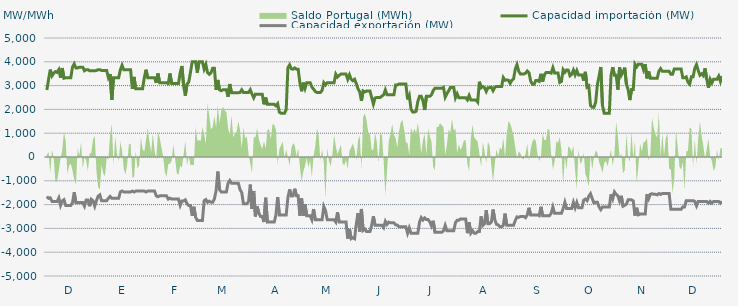
| Category | Capacidad importación (MW) | Capacidad exportación (MW) |
|---|---|---|
| 0 | 2812.5 | -1658.333 |
| 1900-01-01 | 3262.5 | -1737.5 |
| 1900-01-02 | 3670.833 | -1716.667 |
| 1900-01-03 | 3404.167 | -1866.667 |
| 1900-01-04 | 3512.5 | -1866.667 |
| 1900-01-05 | 3589.583 | -1866.667 |
| 1900-01-06 | 3556.25 | -1866.667 |
| 1900-01-07 | 3670.833 | -1716.667 |
| 1900-01-08 | 3329.167 | -2033.333 |
| 1900-01-09 | 3737.5 | -1845.833 |
| 1900-01-10 | 3310.417 | -1791.667 |
| 1900-01-11 | 3329.167 | -2033.333 |
| 1900-01-12 | 3329.167 | -2033.333 |
| 1900-01-13 | 3329.167 | -2033.333 |
| 1900-01-14 | 3329.167 | -2033.333 |
| 1900-01-15 | 3775 | -1916.667 |
| 1900-01-16 | 3912.5 | -1485.417 |
| 1900-01-17 | 3743.75 | -1916.667 |
| 1900-01-18 | 3743.75 | -1916.667 |
| 1900-01-19 | 3775 | -1916.667 |
| 1900-01-20 | 3775 | -1916.667 |
| 1900-01-21 | 3775 | -1916.667 |
| 1900-01-22 | 3625 | -2066.667 |
| 1900-01-23 | 3670.833 | -1804.167 |
| 1900-01-24 | 3670.833 | -1804.167 |
| 1900-01-25 | 3625 | -2066.667 |
| 1900-01-26 | 3625 | -1779.167 |
| 1900-01-27 | 3625 | -1841.667 |
| 1900-01-28 | 3625 | -2066.667 |
| 1900-01-29 | 3633.333 | -1833.333 |
| 1900-01-30 | 3670.833 | -1645.833 |
| 1900-01-31 | 3670.833 | -1591.667 |
| 1900-02-01 | 3633.333 | -1833.333 |
| 1900-02-02 | 3633.333 | -1833.333 |
| 1900-02-03 | 3633.333 | -1833.333 |
| 1900-02-04 | 3633.333 | -1833.333 |
| 1900-02-05 | 3333.333 | -1733.333 |
| 1900-02-06 | 3483.333 | -1658.333 |
| 1900-02-07 | 2393.75 | -1733.333 |
| 1900-02-08 | 3333.333 | -1733.333 |
| 1900-02-09 | 3333.333 | -1733.333 |
| 1900-02-10 | 3333.333 | -1733.333 |
| 1900-02-11 | 3333.333 | -1733.333 |
| 1900-02-12 | 3662.5 | -1466.667 |
| 1900-02-13 | 3854.167 | -1429.167 |
| 1900-02-14 | 3662.5 | -1466.667 |
| 1900-02-15 | 3662.5 | -1466.667 |
| 1900-02-16 | 3662.5 | -1466.667 |
| 1900-02-17 | 3662.5 | -1466.667 |
| 1900-02-18 | 3662.5 | -1466.667 |
| 1900-02-19 | 2862.5 | -1433.333 |
| 1900-02-20 | 3364.583 | -1470.833 |
| 1900-02-21 | 2862.5 | -1433.333 |
| 1900-02-22 | 2862.5 | -1433.333 |
| 1900-02-23 | 2862.5 | -1433.333 |
| 1900-02-24 | 2862.5 | -1433.333 |
| 1900-02-25 | 2862.5 | -1433.333 |
| 1900-02-26 | 3333.333 | -1433.333 |
| 1900-02-27 | 3666.667 | -1470.833 |
| 1900-02-28 | 3333.333 | -1433.333 |
| 1900-02-28 | 3333.333 | -1433.333 |
| 1900-03-01 | 3333.333 | -1433.333 |
| 1900-03-02 | 3333.333 | -1433.333 |
| 1900-03-03 | 3333.333 | -1433.333 |
| 1900-03-04 | 3116.667 | -1633.333 |
| 1900-03-05 | 3508.333 | -1670.833 |
| 1900-03-06 | 3116.667 | -1633.333 |
| 1900-03-07 | 3116.667 | -1633.333 |
| 1900-03-08 | 3116.667 | -1633.333 |
| 1900-03-09 | 3116.667 | -1633.333 |
| 1900-03-10 | 3116.667 | -1633.333 |
| 1900-03-11 | 3087.5 | -1766.667 |
| 1900-03-12 | 3508.333 | -1729.167 |
| 1900-03-13 | 3087.5 | -1766.667 |
| 1900-03-14 | 3087.5 | -1766.667 |
| 1900-03-15 | 3087.5 | -1766.667 |
| 1900-03-16 | 3087.5 | -1766.667 |
| 1900-03-17 | 3087.5 | -1766.667 |
| 1900-03-18 | 3550 | -2033.333 |
| 1900-03-19 | 3825 | -1845.833 |
| 1900-03-20 | 2987.5 | -1845.833 |
| 1900-03-21 | 2575 | -1800 |
| 1900-03-22 | 3062.5 | -1962.5 |
| 1900-03-23 | 3154.167 | -2033.333 |
| 1900-03-24 | 3550 | -2033.333 |
| 1900-03-25 | 4000 | -2466.667 |
| 1900-03-26 | 4000 | -2091.667 |
| 1900-03-27 | 4000 | -2529.167 |
| 1900-03-28 | 3545.833 | -2666.667 |
| 1900-03-29 | 4000 | -2666.667 |
| 1900-03-30 | 4000 | -2666.667 |
| 1900-03-31 | 4000 | -2666.667 |
| 1900-04-01 | 3691.667 | -1837.5 |
| 1900-04-02 | 3883.333 | -1787.5 |
| 1900-04-03 | 3545.833 | -1900 |
| 1900-04-04 | 3475 | -1854.167 |
| 1900-04-05 | 3537.5 | -1900 |
| 1900-04-06 | 3733.333 | -1900 |
| 1900-04-07 | 3733.333 | -1762.5 |
| 1900-04-08 | 2825 | -1416.667 |
| 1900-04-09 | 3237.5 | -612.5 |
| 1900-04-10 | 2825 | -1370.833 |
| 1900-04-11 | 2787.5 | -1466.667 |
| 1900-04-12 | 2825 | -1466.667 |
| 1900-04-13 | 2825 | -1466.667 |
| 1900-04-14 | 2825 | -1466.667 |
| 1900-04-15 | 2529.167 | -1100 |
| 1900-04-16 | 3066.667 | -987.5 |
| 1900-04-17 | 2700 | -1100 |
| 1900-04-18 | 2700 | -1100 |
| 1900-04-19 | 2700 | -1100 |
| 1900-04-20 | 2700 | -1100 |
| 1900-04-21 | 2700 | -1100 |
| 1900-04-22 | 2712.5 | -1368.75 |
| 1900-04-23 | 2823.913 | -1495.652 |
| 1900-04-24 | 2712.5 | -1966.667 |
| 1900-04-25 | 2712.5 | -1966.667 |
| 1900-04-26 | 2712.5 | -1966.667 |
| 1900-04-27 | 2712.5 | -1862.5 |
| 1900-04-28 | 2827.083 | -1160.417 |
| 1900-04-29 | 2645.833 | -2179.167 |
| 1900-04-30 | 2487.5 | -1427.083 |
| 1900-05-01 | 2639.583 | -2495.833 |
| 1900-05-02 | 2633.333 | -2079.167 |
| 1900-05-03 | 2633.333 | -2350 |
| 1900-05-04 | 2633.333 | -2500 |
| 1900-05-05 | 2633.333 | -2500 |
| 1900-05-06 | 2212.5 | -2733.333 |
| 1900-05-07 | 2495.833 | -1712.5 |
| 1900-05-08 | 2212.5 | -2733.333 |
| 1900-05-09 | 2212.5 | -2725 |
| 1900-05-10 | 2212.5 | -2733.333 |
| 1900-05-11 | 2212.5 | -2733.333 |
| 1900-05-12 | 2212.5 | -2733.333 |
| 1900-05-13 | 2150 | -2433.333 |
| 1900-05-14 | 2241.667 | -1683.333 |
| 1900-05-15 | 1883.333 | -2433.333 |
| 1900-05-16 | 1837.5 | -2433.333 |
| 1900-05-17 | 1837.5 | -2433.333 |
| 1900-05-18 | 1837.5 | -2433.333 |
| 1900-05-19 | 1987.5 | -2433.333 |
| 1900-05-20 | 3754.167 | -1700 |
| 1900-05-21 | 3870.833 | -1362.5 |
| 1900-05-22 | 3704.167 | -1637.5 |
| 1900-05-23 | 3687.5 | -1633.333 |
| 1900-05-24 | 3743.75 | -1333.333 |
| 1900-05-25 | 3687.5 | -1633.333 |
| 1900-05-26 | 3687.5 | -1633.333 |
| 1900-05-27 | 3125 | -2466.667 |
| 1900-05-28 | 2762.5 | -1741.667 |
| 1900-05-29 | 3125 | -2466.667 |
| 1900-05-30 | 2881.25 | -1979.167 |
| 1900-05-31 | 3125 | -2466.667 |
| 1900-06-01 | 3125 | -2466.667 |
| 1900-06-02 | 3125 | -2466.667 |
| 1900-06-03 | 2941.667 | -2633.333 |
| 1900-06-04 | 2852.083 | -2187.5 |
| 1900-06-05 | 2752.083 | -2633.333 |
| 1900-06-06 | 2712.5 | -2633.333 |
| 1900-06-07 | 2712.5 | -2633.333 |
| 1900-06-08 | 2712.5 | -2633.333 |
| 1900-06-09 | 2795.833 | -2633.333 |
| 1900-06-10 | 3125 | -2079.583 |
| 1900-06-11 | 3029.167 | -2250 |
| 1900-06-12 | 3125 | -2633.333 |
| 1900-06-13 | 3125 | -2633.333 |
| 1900-06-14 | 3125 | -2633.333 |
| 1900-06-15 | 3125 | -2633.333 |
| 1900-06-16 | 3125 | -2633.333 |
| 1900-06-17 | 3483.333 | -2733.333 |
| 1900-06-18 | 3358.333 | -2320.833 |
| 1900-06-19 | 3429.167 | -2733.333 |
| 1900-06-20 | 3483.333 | -2733.333 |
| 1900-06-21 | 3483.333 | -2733.333 |
| 1900-06-22 | 3483.333 | -2733.333 |
| 1900-06-23 | 3483.333 | -2733.333 |
| 1900-06-24 | 3266.667 | -3433.333 |
| 1900-06-25 | 3454.167 | -3020.833 |
| 1900-06-26 | 3266.667 | -3433.333 |
| 1900-06-27 | 3204.167 | -3391.667 |
| 1900-06-28 | 3266.667 | -3433.333 |
| 1900-06-29 | 3083.333 | -2816.667 |
| 1900-06-30 | 2866.667 | -2362.5 |
| 1900-07-01 | 2737.5 | -3133.333 |
| 1900-07-02 | 2358.333 | -2183.333 |
| 1900-07-03 | 2775 | -3085.417 |
| 1900-07-04 | 2733.333 | -3029.167 |
| 1900-07-05 | 2775 | -3133.333 |
| 1900-07-06 | 2775 | -3133.333 |
| 1900-07-07 | 2775 | -3133.333 |
| 1900-07-08 | 2500 | -2866.667 |
| 1900-07-09 | 2225 | -2491.667 |
| 1900-07-10 | 2481.25 | -2866.667 |
| 1900-07-11 | 2500 | -2866.667 |
| 1900-07-12 | 2500 | -2866.667 |
| 1900-07-13 | 2500 | -2866.667 |
| 1900-07-14 | 2562.5 | -2866.667 |
| 1900-07-15 | 2612.5 | -2966.667 |
| 1900-07-16 | 2818.75 | -2704.167 |
| 1900-07-17 | 2612.5 | -2833.333 |
| 1900-07-18 | 2612.5 | -2737.5 |
| 1900-07-19 | 2612.5 | -2766.667 |
| 1900-07-20 | 2612.5 | -2766.667 |
| 1900-07-21 | 2612.5 | -2766.667 |
| 1900-07-22 | 3025 | -2850 |
| 1900-07-23 | 3029.167 | -2858.333 |
| 1900-07-24 | 3066.667 | -2933.333 |
| 1900-07-25 | 3066.667 | -2933.333 |
| 1900-07-26 | 3066.667 | -2933.333 |
| 1900-07-27 | 3066.667 | -2933.333 |
| 1900-07-28 | 3066.667 | -2933.333 |
| 1900-07-29 | 2416.667 | -3200 |
| 1900-07-30 | 2585.417 | -2975 |
| 1900-07-31 | 2012.5 | -3200 |
| 1900-08-01 | 1887.5 | -3200 |
| 1900-08-02 | 1887.5 | -3200 |
| 1900-08-03 | 1920.833 | -3200 |
| 1900-08-04 | 2333.333 | -3200 |
| 1900-08-05 | 2550 | -2733.333 |
| 1900-08-06 | 2550 | -2545.833 |
| 1900-08-07 | 2362.5 | -2645.833 |
| 1900-08-08 | 1975 | -2558.333 |
| 1900-08-09 | 2550 | -2629.167 |
| 1900-08-10 | 2550 | -2629.167 |
| 1900-08-11 | 2550 | -2729.167 |
| 1900-08-12 | 2616.667 | -2895.833 |
| 1900-08-13 | 2793.75 | -2679.167 |
| 1900-08-14 | 2887.5 | -3166.667 |
| 1900-08-15 | 2887.5 | -3166.667 |
| 1900-08-16 | 2887.5 | -3166.667 |
| 1900-08-17 | 2887.5 | -3166.667 |
| 1900-08-18 | 2887.5 | -3166.667 |
| 1900-08-19 | 2925 | -3100 |
| 1900-08-20 | 2512.5 | -2875 |
| 1900-08-21 | 2658.333 | -3100 |
| 1900-08-22 | 2779.167 | -3100 |
| 1900-08-23 | 2925 | -3100 |
| 1900-08-24 | 2925 | -3100 |
| 1900-08-25 | 2925 | -3100 |
| 1900-08-26 | 2487.5 | -2758.333 |
| 1900-08-27 | 2656.25 | -2658.333 |
| 1900-08-28 | 2487.5 | -2654.167 |
| 1900-08-29 | 2487.5 | -2600 |
| 1900-08-30 | 2487.5 | -2600 |
| 1900-08-31 | 2487.5 | -2600 |
| 1900-09-01 | 2487.5 | -2600 |
| 1900-09-02 | 2400 | -3200 |
| 1900-09-03 | 2583.333 | -2750 |
| 1900-09-04 | 2400 | -3200 |
| 1900-09-05 | 2400 | -3100 |
| 1900-09-06 | 2400 | -3200 |
| 1900-09-07 | 2400 | -3200 |
| 1900-09-08 | 2308.333 | -3133.333 |
| 1900-09-09 | 3162.5 | -3133.333 |
| 1900-09-10 | 2910.417 | -2495.833 |
| 1900-09-11 | 2962.5 | -2875 |
| 1900-09-12 | 2912.5 | -2800 |
| 1900-09-13 | 2752.083 | -2237.5 |
| 1900-09-14 | 2912.5 | -2800 |
| 1900-09-15 | 2912.5 | -2800 |
| 1900-09-16 | 2933.333 | -2733.333 |
| 1900-09-17 | 2787.5 | -2208.333 |
| 1900-09-18 | 2929.167 | -2633.333 |
| 1900-09-19 | 2962.5 | -2829.167 |
| 1900-09-20 | 2962.5 | -2850 |
| 1900-09-21 | 2962.5 | -2933.333 |
| 1900-09-22 | 2962.5 | -2933.333 |
| 1900-09-23 | 3337.5 | -2866.667 |
| 1900-09-24 | 3222.917 | -2379.167 |
| 1900-09-25 | 3237.5 | -2866.667 |
| 1900-09-26 | 3225 | -2866.667 |
| 1900-09-27 | 3095.833 | -2866.667 |
| 1900-09-28 | 3225 | -2866.667 |
| 1900-09-29 | 3281.25 | -2866.667 |
| 1900-09-30 | 3700 | -2666.667 |
| 1900-10-01 | 3883.333 | -2516.667 |
| 1900-10-02 | 3600 | -2537.5 |
| 1900-10-03 | 3487.5 | -2500 |
| 1900-10-04 | 3487.5 | -2500 |
| 1900-10-05 | 3487.5 | -2500 |
| 1900-10-06 | 3518.75 | -2550 |
| 1900-10-07 | 3612.5 | -2433.333 |
| 1900-10-08 | 3543.75 | -2133.333 |
| 1900-10-09 | 3193.75 | -2433.333 |
| 1900-10-10 | 3060.417 | -2433.333 |
| 1900-10-11 | 3059.167 | -2433.333 |
| 1900-10-12 | 3212.5 | -2433.333 |
| 1900-10-13 | 3212.5 | -2433.333 |
| 1900-10-14 | 3175 | -2466.667 |
| 1900-10-15 | 3495.833 | -2091.667 |
| 1900-10-16 | 3166.667 | -2466.667 |
| 1900-10-17 | 3454.167 | -2466.667 |
| 1900-10-18 | 3550 | -2466.667 |
| 1900-10-19 | 3550 | -2466.667 |
| 1900-10-20 | 3550 | -2466.667 |
| 1900-10-21 | 3525 | -2366.667 |
| 1900-10-22 | 3754.167 | -2104.167 |
| 1900-10-23 | 3525 | -2366.667 |
| 1900-10-24 | 3525 | -2366.667 |
| 1900-10-25 | 3525 | -2366.667 |
| 1900-10-26 | 3135 | -2366.667 |
| 1900-10-27 | 3175 | -2366.667 |
| 1900-10-28 | 3666.667 | -2166.667 |
| 1900-10-29 | 3558.333 | -1904.167 |
| 1900-10-30 | 3658.333 | -2166.667 |
| 1900-10-31 | 3650 | -2166.667 |
| 1900-11-01 | 3412.5 | -2166.667 |
| 1900-11-02 | 3475 | -2166.667 |
| 1900-11-03 | 3650 | -1904.167 |
| 1900-11-04 | 3450 | -2133.333 |
| 1900-11-05 | 3633.333 | -1912.5 |
| 1900-11-06 | 3450 | -2133.333 |
| 1900-11-07 | 3450 | -2133.333 |
| 1900-11-08 | 3450 | -2133.333 |
| 1900-11-09 | 3210.417 | -1816.667 |
| 1900-11-10 | 3577.083 | -1766.667 |
| 1900-11-11 | 2937.5 | -1833.333 |
| 1900-11-12 | 2985.417 | -1645.833 |
| 1900-11-13 | 2162.5 | -1541.667 |
| 1900-11-14 | 2087.5 | -1745.833 |
| 1900-11-15 | 2087.5 | -1929.167 |
| 1900-11-16 | 2295.833 | -1900 |
| 1900-11-17 | 3025 | -1900 |
| 1900-11-18 | 3395.833 | -2100 |
| 1900-11-19 | 3781.25 | -2212.5 |
| 1900-11-20 | 2170.833 | -2100 |
| 1900-11-21 | 1837.5 | -2100 |
| 1900-11-22 | 1837.5 | -2100 |
| 1900-11-23 | 1837.5 | -2100 |
| 1900-11-24 | 1837.5 | -2100 |
| 1900-11-25 | 3433.333 | -1566.667 |
| 1900-11-26 | 3776 | -1760 |
| 1900-11-27 | 3433.333 | -1466.667 |
| 1900-11-28 | 3433.333 | -1566.667 |
| 1900-11-29 | 2829.167 | -1633.333 |
| 1900-11-30 | 3766.667 | -1854.167 |
| 1900-12-01 | 3433.333 | -1629.167 |
| 1900-12-02 | 3562.5 | -2066.667 |
| 1900-12-03 | 3754.167 | -2029.167 |
| 1900-12-04 | 3064.583 | -1979.167 |
| 1900-12-05 | 2833.333 | -1800 |
| 1900-12-06 | 2391.667 | -1800 |
| 1900-12-07 | 2833.333 | -1800 |
| 1900-12-08 | 2833.333 | -1841.667 |
| 1900-12-09 | 3900 | -2466.667 |
| 1900-12-10 | 3787.5 | -2133.333 |
| 1900-12-11 | 3900 | -2429.167 |
| 1900-12-12 | 3900 | -2400 |
| 1900-12-13 | 3900 | -2400 |
| 1900-12-14 | 3668.75 | -2400 |
| 1900-12-15 | 3900 | -2400 |
| 1900-12-16 | 3304.167 | -1566.667 |
| 1900-12-17 | 3595.833 | -1754.167 |
| 1900-12-18 | 3304.167 | -1566.667 |
| 1900-12-19 | 3304.167 | -1541.667 |
| 1900-12-20 | 3304.167 | -1566.667 |
| 1900-12-21 | 3304.167 | -1566.667 |
| 1900-12-22 | 3304.167 | -1591.667 |
| 1900-12-23 | 3600 | -1533.333 |
| 1900-12-24 | 3712.5 | -1570.833 |
| 1900-12-25 | 3600 | -1533.333 |
| 1900-12-26 | 3600 | -1533.333 |
| 1900-12-27 | 3600 | -1533.333 |
| 1900-12-28 | 3600 | -1533.333 |
| 1900-12-29 | 3600 | -1533.333 |
| 1900-12-30 | 3475 | -2200 |
| 1900-12-31 | 3475 | -2200 |
| 1901-01-01 | 3700 | -2200 |
| 1901-01-02 | 3700 | -2200 |
| 1901-01-03 | 3700 | -2200 |
| 1901-01-04 | 3700 | -2200 |
| 1901-01-05 | 3700 | -2200 |
| 1901-01-06 | 3329.167 | -2095.833 |
| 1901-01-07 | 3329.167 | -2095.833 |
| 1901-01-08 | 3366.667 | -1833.333 |
| 1901-01-09 | 3141.667 | -1833.333 |
| 1901-01-10 | 3058.333 | -1833.333 |
| 1901-01-11 | 3366.667 | -1833.333 |
| 1901-01-12 | 3366.667 | -1833.333 |
| 1901-01-13 | 3725 | -1866.667 |
| 1901-01-14 | 3883.333 | -2054.167 |
| 1901-01-15 | 3631.25 | -1866.667 |
| 1901-01-16 | 3435.417 | -1866.667 |
| 1901-01-17 | 3495.833 | -1866.667 |
| 1901-01-18 | 3416.667 | -1866.667 |
| 1901-01-19 | 3725 | -1866.667 |
| 1901-01-20 | 3266.667 | -1866.667 |
| 1901-01-21 | 2912.5 | -1941.667 |
| 1901-01-22 | 3266.667 | -1866.667 |
| 1901-01-23 | 3116.667 | -1941.667 |
| 1901-01-24 | 3266.667 | -1866.667 |
| 1901-01-25 | 3266.667 | -1866.667 |
| 1901-01-26 | 3266.667 | -1866.667 |
| 1901-01-27 | 3400 | -1866.667 |
| 1901-01-28 | 3175 | -1941.667 |
| 1901-01-29 | 3400 | -1866.667 |